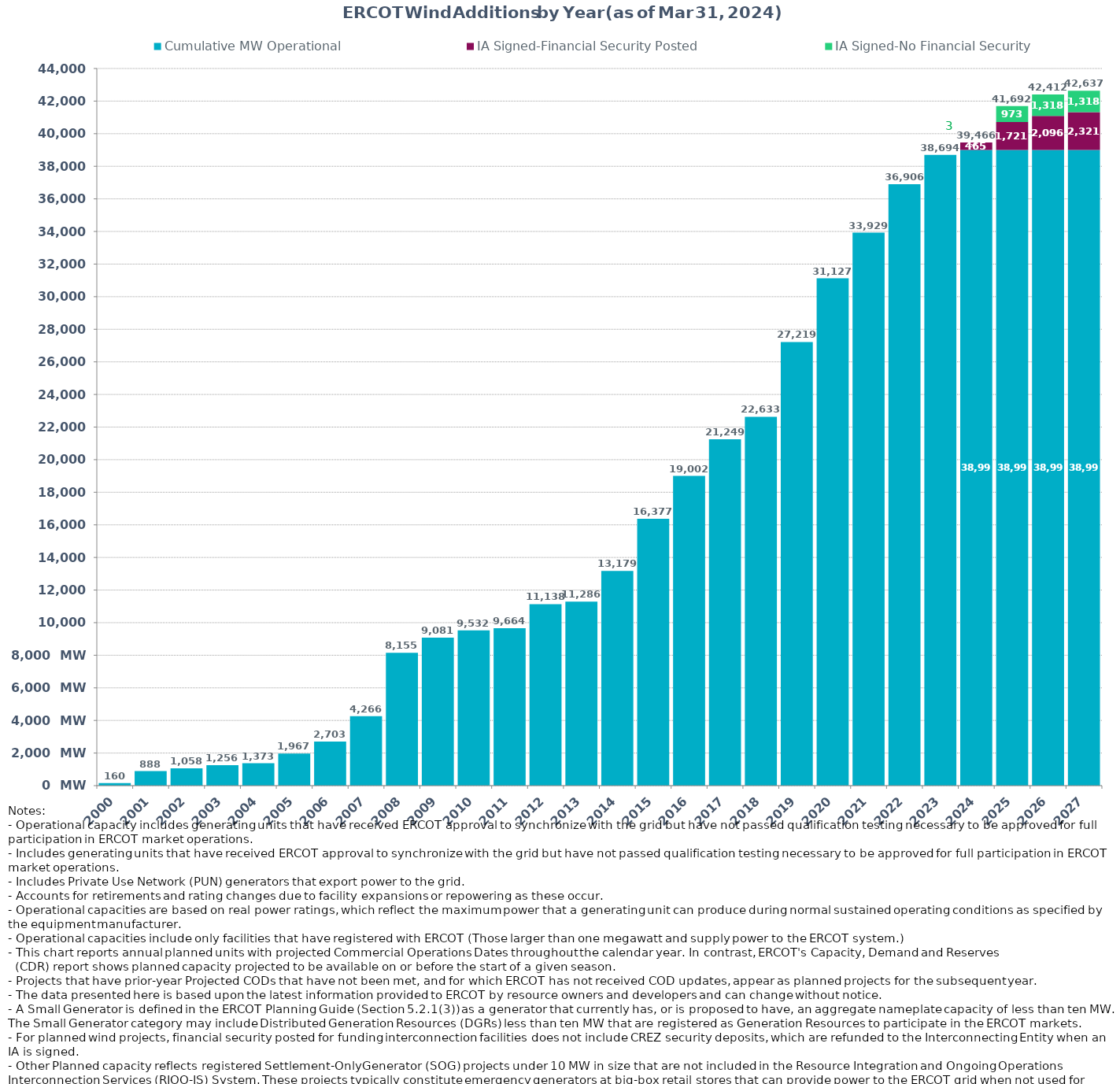
| Category | Cumulative MW Operational | IA Signed-Financial Security Posted  | IA Signed-No Financial Security  | Other Planned | Cumulative Installed and Planned |
|---|---|---|---|---|---|
| 2000.0 | 160.37 | 0 | 0 | 0 | 160.37 |
| 2001.0 | 887.97 | 0 | 0 | 0 | 887.97 |
| 2002.0 | 1058.22 | 0 | 0 | 0 | 1058.22 |
| 2003.0 | 1255.72 | 0 | 0 | 0 | 1255.72 |
| 2004.0 | 1372.82 | 0 | 0 | 0 | 1372.82 |
| 2005.0 | 1967.04 | 0 | 0 | 0 | 1967.04 |
| 2006.0 | 2703.34 | 0 | 0 | 0 | 2703.34 |
| 2007.0 | 4266.36 | 0 | 0 | 0 | 4266.36 |
| 2008.0 | 8154.76 | 0 | 0 | 0 | 8154.76 |
| 2009.0 | 9080.78 | 0 | 0 | 0 | 9080.78 |
| 2010.0 | 9531.7 | 0 | 0 | 0 | 9531.7 |
| 2011.0 | 9663.7 | 0 | 0 | 0 | 9663.7 |
| 2012.0 | 11137.66 | 0 | 0 | 0 | 11137.66 |
| 2013.0 | 11286.26 | 0 | 0 | 0 | 11286.26 |
| 2014.0 | 13178.84 | 0 | 0 | 0 | 13178.84 |
| 2015.0 | 16376.53 | 0 | 0 | 0 | 16376.53 |
| 2016.0 | 19001.85 | 0 | 0 | 0 | 19001.85 |
| 2017.0 | 21248.99 | 0 | 0 | 0 | 21248.99 |
| 2018.0 | 22632.69 | 0 | 0 | 0 | 22632.69 |
| 2019.0 | 27219.34 | 0 | 0 | 0 | 27219.34 |
| 2020.0 | 31127.31 | 0 | 0 | 0 | 31127.31 |
| 2021.0 | 33928.91 | 0 | 0 | 0 | 33928.91 |
| 2022.0 | 36906.07 | 0 | 0 | 0 | 36906.07 |
| 2023.0 | 38694.49 | 0 | 0 | 0 | 38694.49 |
| 2024.0 | 38998.01 | 464.85 | 3 | 0 | 39465.86 |
| 2025.0 | 38998.01 | 1720.87 | 973.39 | 0 | 41692.27 |
| 2026.0 | 38998.01 | 2095.93 | 1317.8 | 0 | 42411.74 |
| 2027.0 | 38998.01 | 2320.93 | 1317.8 | 0 | 42636.74 |